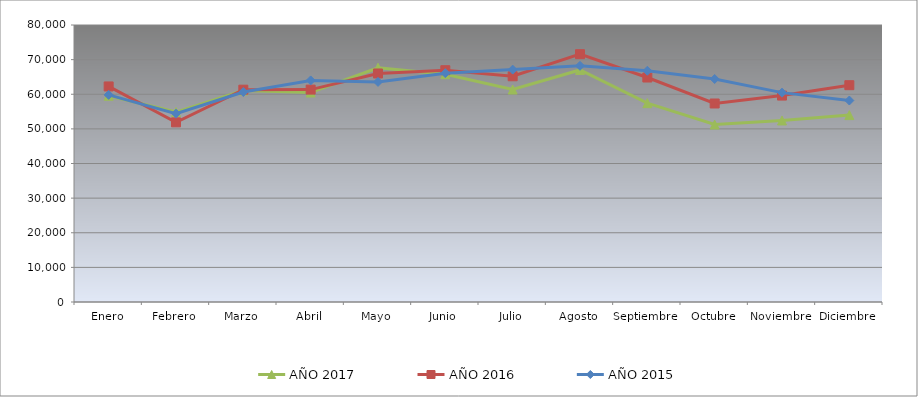
| Category | AÑO 2017 | AÑO 2016 | AÑO 2015 |
|---|---|---|---|
| Enero | 59565.747 | 62253.371 | 59809.66 |
| Febrero | 54851.065 | 51881.333 | 54412.66 |
| Marzo | 61082.931 | 61321.608 | 60640.35 |
| Abril | 60503.572 | 61337.113 | 63999.287 |
| Mayo | 67656.811 | 66000.161 | 63562.306 |
| Junio | 65788.511 | 66943.201 | 66093.392 |
| Julio | 61360.883 | 65189.625 | 67114.906 |
| Agosto | 67016.541 | 71575.237 | 68214.453 |
| Septiembre | 57426.146 | 64828.76 | 66784.333 |
| Octubre | 51248.19 | 57332.362 | 64406.474 |
| Noviembre | 52430.011 | 59616.663 | 60464.422 |
| Diciembre | 53978.701 | 62614.236 | 58186.587 |